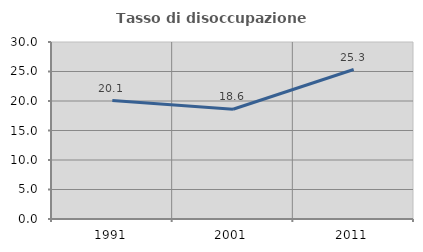
| Category | Tasso di disoccupazione giovanile  |
|---|---|
| 1991.0 | 20.079 |
| 2001.0 | 18.605 |
| 2011.0 | 25.333 |